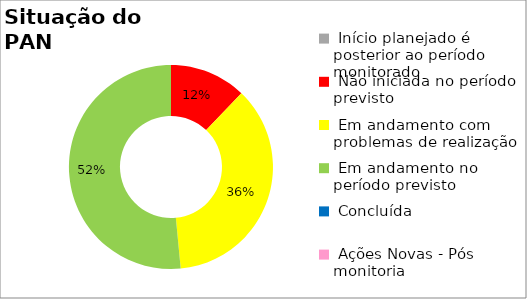
| Category | Series 0 |
|---|---|
|  Início planejado é posterior ao período monitorado | 0 |
|  Não iniciada no período previsto | 0.121 |
|  Em andamento com problemas de realização | 0.364 |
|  Em andamento no período previsto  | 0.515 |
|  Concluída | 0 |
|  Ações Novas - Pós monitoria | 0 |